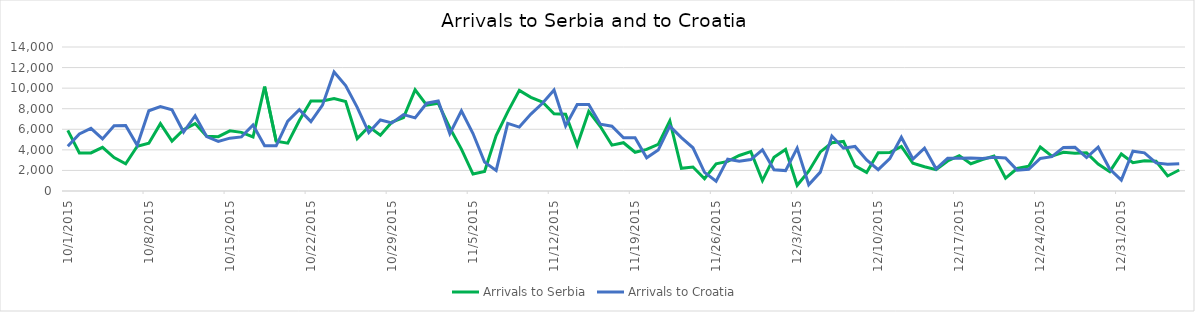
| Category | Arrivals to Serbia | Arrivals to Croatia |
|---|---|---|
| 10/1/15 | 5900 | 4344 |
| 10/2/15 | 3700 | 5546 |
| 10/3/15 | 3700 | 6086 |
| 10/4/15 | 4250 | 5065 |
| 10/5/15 | 3250 | 6338 |
| 10/6/15 | 2650 | 6370 |
| 10/7/15 | 4350 | 4446 |
| 10/8/15 | 4650 | 7798 |
| 10/9/15 | 6550 | 8201 |
| 10/10/15 | 4850 | 7896 |
| 10/11/15 | 5950 | 5732 |
| 10/12/15 | 6556 | 7317 |
| 10/13/15 | 5330 | 5286 |
| 10/14/15 | 5280 | 4814 |
| 10/15/15 | 5850 | 5138 |
| 10/16/15 | 5700 | 5260 |
| 10/17/15 | 5250 | 6415 |
| 10/18/15 | 10150 | 4390 |
| 10/19/15 | 4850 | 4388 |
| 10/20/15 | 4650 | 6793 |
| 10/21/15 | 6850 | 7900 |
| 10/22/15 | 8750 | 6748 |
| 10/23/15 | 8750 | 8348 |
| 10/24/15 | 9000 | 11570 |
| 10/25/15 | 8700 | 10249 |
| 10/26/15 | 5100 | 8128 |
| 10/27/15 | 6257 | 5683 |
| 10/28/15 | 5415 | 6900 |
| 10/29/15 | 6700 | 6615 |
| 10/30/15 | 7138 | 7429 |
| 10/31/15 | 9834 | 7110 |
| 11/1/15 | 8354 | 8534 |
| 11/2/15 | 8521 | 8746 |
| 11/3/15 | 6129 | 5573 |
| 11/4/15 | 4073 | 7792 |
| 11/5/15 | 1652 | 5587 |
| 11/6/15 | 1906 | 2809 |
| 11/7/15 | 5397 | 2000 |
| 11/8/15 | 7695 | 6579 |
| 11/9/15 | 9785 | 6214 |
| 11/10/15 | 9107 | 7474 |
| 11/11/15 | 8648 | 8524 |
| 11/12/15 | 7500 | 9823 |
| 11/13/15 | 7464 | 6314 |
| 11/14/15 | 4453 | 8405 |
| 11/15/15 | 7734 | 8415 |
| 11/16/15 | 6267 | 6490 |
| 11/17/15 | 4460 | 6304 |
| 11/18/15 | 4694 | 5180 |
| 11/19/15 | 3765 | 5167 |
| 11/20/15 | 4042 | 3230 |
| 11/21/15 | 4527 | 3977 |
| 11/22/15 | 6826 | 6305 |
| 11/23/15 | 2201 | 5184 |
| 11/24/15 | 2335 | 4203 |
| 11/25/15 | 1194 | 1808 |
| 11/26/15 | 2636 | 952 |
| 11/27/15 | 2878 | 3095 |
| 11/28/15 | 3454 | 2886 |
| 11/29/15 | 3825 | 3060 |
| 11/30/15 | 1009 | 4009 |
| 12/1/15 | 3284 | 2066 |
| 12/2/15 | 4040 | 1982 |
| 12/3/15 | 553 | 4174 |
| 12/4/15 | 1927 | 611 |
| 12/5/15 | 3799 | 1835 |
| 12/6/15 | 4686 | 5339 |
| 12/7/15 | 4823 | 4162 |
| 12/8/15 | 2437 | 4335 |
| 12/9/15 | 1807 | 3027 |
| 12/10/15 | 3723 | 2076 |
| 12/11/15 | 3747 | 3149 |
| 12/12/15 | 4339 | 5225 |
| 12/13/15 | 2698 | 3112 |
| 12/14/15 | 2353 | 4174 |
| 12/15/15 | 2067 | 2160 |
| 12/16/15 | 2916 | 3177 |
| 12/17/15 | 3438 | 3192 |
| 12/18/15 | 2649 | 3200 |
| 12/19/15 | 3052 | 3156 |
| 12/20/15 | 3405 | 3276 |
| 12/21/15 | 1253 | 3210 |
| 12/22/15 | 2186 | 2027 |
| 12/23/15 | 2415 | 2116 |
| 12/24/15 | 4279 | 3166 |
| 12/25/15 | 3390 | 3339 |
| 12/26/15 | 3757 | 4241 |
| 12/27/15 | 3674 | 4251 |
| 12/28/15 | 3708 | 3249 |
| 12/29/15 | 2629 | 4253 |
| 12/30/15 | 1879 | 2132 |
| 12/31/15 | 3602 | 1058 |
| 1/1/16 | 2745 | 3869 |
| 1/2/16 | 2947 | 3710 |
| 1/3/16 | 2889 | 2732 |
| 1/4/16 | 1462 | 2591 |
| 1/5/16 | 2041 | 2650 |